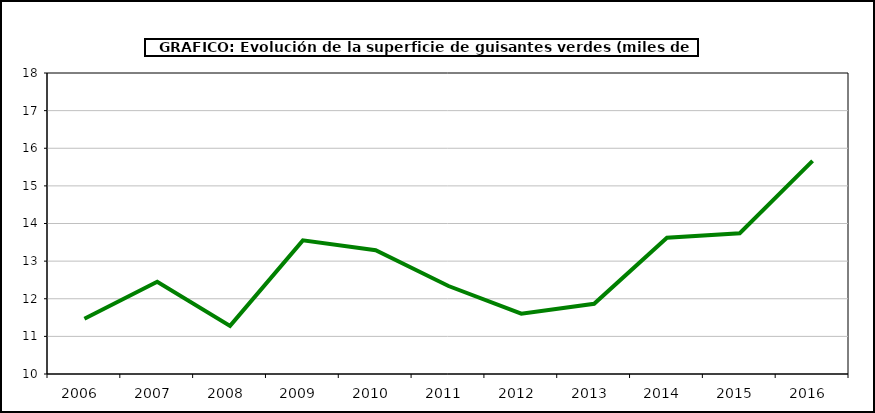
| Category | superficie |
|---|---|
| 2006.0 | 11.47 |
| 2007.0 | 12.451 |
| 2008.0 | 11.28 |
| 2009.0 | 13.552 |
| 2010.0 | 13.288 |
| 2011.0 | 12.338 |
| 2012.0 | 11.604 |
| 2013.0 | 11.867 |
| 2014.0 | 13.624 |
| 2015.0 | 13.74 |
| 2016.0 | 15.663 |